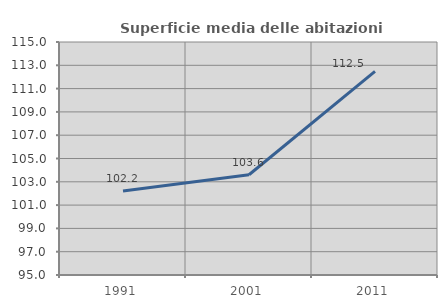
| Category | Superficie media delle abitazioni occupate |
|---|---|
| 1991.0 | 102.204 |
| 2001.0 | 103.605 |
| 2011.0 | 112.476 |